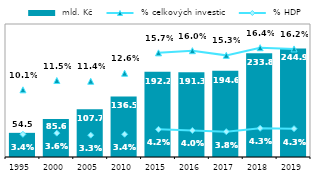
| Category |  mld. Kč |
|---|---|
| 1995.0 | 54.488 |
| 2000.0 | 85.6 |
| 2005.0 | 107.746 |
| 2010.0 | 136.519 |
| 2015.0 | 192.247 |
| 2016.0 | 191.276 |
| 2017.0 | 194.625 |
| 2018.0 | 233.83 |
| 2019.0 | 244.873 |